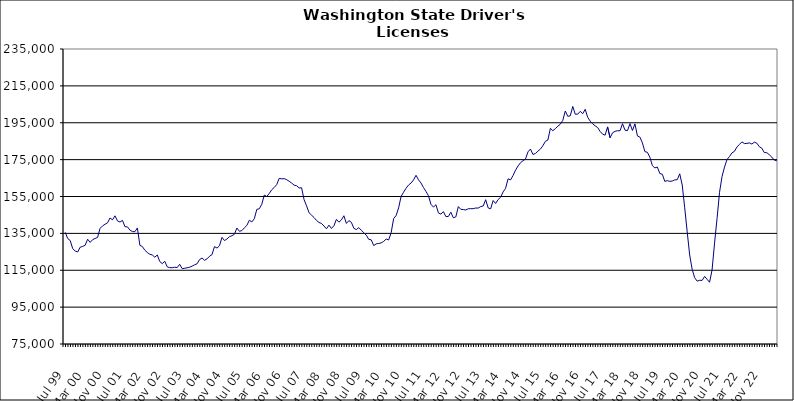
| Category | Series 0 |
|---|---|
| Jul 99 | 135560 |
| Aug 99 | 132182 |
| Sep 99 | 131104 |
| Oct 99 | 126694 |
| Nov 99 | 125425 |
| Dec 99 | 124927 |
| Jan 00 | 127499 |
| Feb 00 | 127927 |
| Mar 00 | 128547 |
| Apr 00 | 131834 |
| May 00 | 130120 |
| Jun 00 | 131595 |
| Jul 00 | 132236 |
| Aug 00 | 132819 |
| Sep 00 | 137711 |
| Oct 00 | 139063 |
| Nov 00 | 139952 |
| Dec 00 | 140732 |
| Jan 01 | 143338 |
| Feb 01 | 142359 |
| Mar 01 | 144523 |
| Apr 01 | 141758 |
| May 01 | 141135 |
| Jun 01 | 142064 |
| Jul 01 | 138646 |
| Aug 01 | 138530 |
| Sep 01 | 136784 |
| Oct 01 | 135996 |
| Nov 01 | 135917 |
| Dec 01 | 137940 |
| Jan 02 | 128531 |
| Feb 02 | 127848 |
| Mar 02 | 125876 |
| Apr 02 | 124595 |
| May 02 | 123660 |
| Jun 02 | 123282 |
| Jul 02 | 122089 |
| Aug 02 | 123279 |
| Sep 02 | 119727 |
| Oct 02 | 118588 |
| Nov 02 | 119854 |
| Dec 02 | 116851 |
| Jan 03 | 116407 |
| Feb 03 | 116382 |
| Mar 03 | 116648 |
| Apr 03 | 116471 |
| May 03 | 118231 |
| Jun 03 | 115831 |
| Jul 03 | 116082 |
| Aug 03 | 116341 |
| Sep 03 | 116653 |
| Oct 03 | 117212 |
| Nov 03 | 117962 |
| Dec 03 | 118542 |
| Jan 04 | 120817 |
| Feb 04 | 121617 |
| Mar 04 | 120369 |
| Apr 04 | 121200 |
| May 04 | 122609 |
| Jun 04 | 123484 |
| Jul 04 | 127844 |
| Aug 04 | 127025 |
| Sep 04 | 128273 |
| Oct 04 | 132853 |
| Nov 04 | 131106 |
| Dec 04 | 131935 |
| Jan 05 | 133205 |
| Feb 05 | 133736 |
| Mar 05 | 134528 |
| Apr 05 | 137889 |
| May 05 | 136130 |
| Jun 05 | 136523 |
| Jul 05 | 137997 |
| Aug 05 | 139294 |
| Sep 05 | 142140 |
| Oct 05 | 141192 |
| Nov 05 | 142937 |
| Dec 05 | 148013 |
| Jan 06 | 148341 |
| Feb 06 | 150744 |
| Mar 06 | 155794 |
| Apr 06 | 154984 |
| May 06 | 156651 |
| Jun 06 | 158638 |
| Jul 06 | 159911 |
| Aug 06 | 161445 |
| Sep 06 | 164852 |
| Oct 06 | 164570 |
| Nov 06 | 164679 |
| Dec 06 | 164127 |
| Jan 07 | 163271 |
| Feb 07 | 162273 |
| Mar 07 | 161140 |
| Apr 07 | 160860 |
| May 07 | 159633 |
| Jun 07 | 159724 |
| Jul 07 | 153303 |
| Aug 07 | 149939 |
| Sep 07 | 146172 |
| Oct 07 | 144876 |
| Nov 07 | 143613 |
| Dec 07 | 142022 |
| Jan 08 | 140909 |
| Feb 08 | 140368 |
| Mar 08 | 138998 |
| Apr 08 | 137471 |
| May 08 | 139453 |
| Jun 08 | 137680 |
| Jul 08 | 139120 |
| Aug 08 | 142612 |
| Sep-08 | 141071 |
| Oct 08 | 142313 |
| Nov 08 | 144556 |
| Dec 08 | 140394 |
| Jan 09 | 141903 |
| Feb 09 | 141036 |
| Mar 09 | 137751 |
| Apr 09 | 137060 |
| May 09 | 138101 |
| Jun 09 | 136739 |
| Jul 09 | 135317 |
| Aug 09 | 134020 |
| Sep 09 | 131756 |
| Oct 09 | 131488 |
| Nov 09 | 128370 |
| Dec 09 | 129323 |
| Jan 10 | 129531 |
| Feb 10 | 129848 |
| Mar 10 | 130654 |
| Apr 10 | 131929 |
| May 10 | 131429 |
| Jun 10 | 135357 |
| Jul 10 | 143032 |
| Aug 10 | 144686 |
| Sep 10 | 148856 |
| Oct 10 | 155042 |
| Nov 10 | 157328 |
| Dec 10 | 159501 |
| Jan 11 | 161221 |
| Feb 11 | 162312 |
| Mar 11 | 163996 |
| Apr 11 | 166495 |
| May 11 | 164040 |
| Jun 11 | 162324 |
| Jul 11 | 159862 |
| Aug 11 | 157738 |
| Sep 11 | 155430 |
| Oct 11 | 150762 |
| Nov 11 | 149255 |
| Dec 11 | 150533 |
| Jan 12 | 146068 |
| Feb 12 | 145446 |
| Mar 12 | 146788 |
| Apr 12 | 144110 |
| May 12 | 144162 |
| Jun 12 | 146482 |
| Jul 12 | 143445 |
| Aug 12 | 143950 |
| Sep 12 | 149520 |
| Oct 12 | 148033 |
| Nov 12 | 147926 |
| Dec 12 | 147674 |
| Jan 13 | 148360 |
| Feb-13 | 148388 |
| Mar-13 | 148414 |
| Apr 13 | 148749 |
| May 13 | 148735 |
| Jun-13 | 149521 |
| Jul 13 | 149837 |
| Aug 13 | 153252 |
| Sep 13 | 148803 |
| Oct 13 | 148315 |
| Nov 13 | 152804 |
| Dec 13 | 151209 |
| Jan 14 | 153357 |
| Feb-14 | 154608 |
| Mar 14 | 157479 |
| Apr 14 | 159441 |
| May 14 | 164591 |
| Jun 14 | 163995 |
| Jul-14 | 166411 |
| Aug-14 | 169272 |
| Sep 14 | 171565 |
| Oct 14 | 173335 |
| Nov 14 | 174406 |
| Dec 14 | 175302 |
| Jan 15 | 179204 |
| Feb 15 | 180737 |
| Mar 15 | 177810 |
| Apr-15 | 178331 |
| May 15 | 179601 |
| Jun-15 | 180729 |
| Jul 15 | 182540 |
| Aug 15 | 184924 |
| Sep 15 | 185620 |
| Oct 15 | 192002 |
| Nov 15 | 190681 |
| Dec 15 | 191795 |
| Jan 16 | 193132 |
| Feb 16 | 194206 |
| Mar 16 | 196319 |
| Apr 16 | 201373 |
| May 16 | 198500 |
| Jun 16 | 198743 |
| Jul 16 | 203841 |
| Aug 16 | 199630 |
| Sep 16 | 199655 |
| Oct 16 | 201181 |
| Nov 16 | 199888 |
| Dec 16 | 202304 |
| Jan 17 | 197977 |
| Feb 17 | 195889 |
| Mar 17 | 194438 |
| Apr 17 | 193335 |
| May 17 | 192430 |
| Jun 17 | 190298 |
| Jul 17 | 188832 |
| Aug 17 | 188264 |
| Sep 17 | 192738 |
| Oct 17 | 186856 |
| Nov 17 | 189537 |
| Dec 17 | 190341 |
| Jan 18 | 190670 |
| Feb 18 | 190645 |
| Mar 18 | 194476 |
| Apr 18 | 190971 |
| May 18 | 190707 |
| Jun 18 | 194516 |
| Jul 18 | 190783 |
| Aug 18 | 194390 |
| Sep 18 | 187831 |
| Oct 18 | 187188 |
| Nov 18 | 184054 |
| Dec 18 | 179347 |
| Jan 19 | 178958 |
| Feb 19 | 176289 |
| Mar 19 | 171747 |
| Apr 19 | 170532 |
| May 19 | 170967 |
| Jun 19 | 167444 |
| Jul 19 | 167059 |
| Aug 19 | 163194 |
| Sep 19 | 163599 |
| Oct 19 | 163212 |
| Nov 19 | 163388 |
| Dec 19 | 164024 |
| Jan 20 | 164114 |
| Feb 20 | 167320 |
| Mar 20 | 161221 |
| Apr 20 | 148866 |
| May 20 | 135821 |
| Jun 20 | 123252 |
| Jul 20 | 115526 |
| Aug 20 | 110940 |
| Sep 20 | 109099 |
| Oct 20 | 109566 |
| Nov 20 | 109488 |
| Dec 20 | 111658 |
| Jan 21 | 110070 |
| Feb 21 | 108491 |
| Mar 21 | 115176 |
| Apr 21 | 129726 |
| May 21 | 143052 |
| Jun 21 | 157253 |
| Jul 21 | 165832 |
| Aug 21 | 170937 |
| Sep 21 | 175042 |
| Oct 21 | 176696 |
| Nov 21 | 178677 |
| Dec 21 | 179501 |
| Jan 22 | 181825 |
| Feb 22 | 183258 |
| Mar 22 | 184618 |
| Apr 22 | 183710 |
| May 22 | 183784 |
| Jun 22 | 184101 |
| Jul 22 | 183443 |
| Aug 22 | 184475 |
| Sep 22 | 183902 |
| Oct 22 | 181994 |
| Nov 22 | 181207 |
| Dec 22 | 178793 |
| Jan 23 | 178782 |
| Feb 23 | 177647 |
| Mar 23 | 176386 |
| Apr 23 | 174729 |
| May 23 | 174390 |